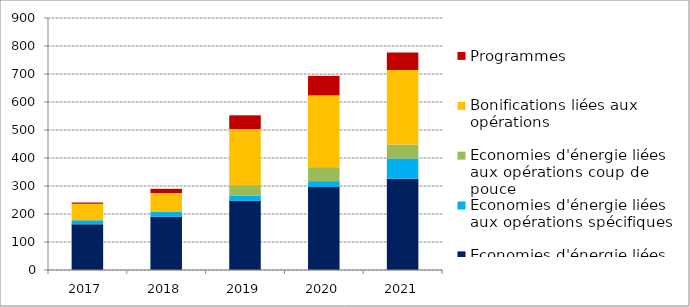
| Category | Economies d'énergie liées aux opérations standardisées | Economies d'énergie liées aux opérations spécifiques | Economies d'énergie liées aux opérations coup de pouce | Bonifications liées aux opérations | Programmes |
|---|---|---|---|---|---|
| 2017.0 | 163 | 15 | 0 | 59 | 4 |
| 2018.0 | 190 | 17 | 0 | 68 | 15 |
| 2019.0 | 247 | 19 | 37 | 200.4 | 49 |
| 2020.0 | 296.4 | 21 | 50 | 256.08 | 70 |
| 2021.0 | 326.04 | 72 | 50 | 266.688 | 62 |